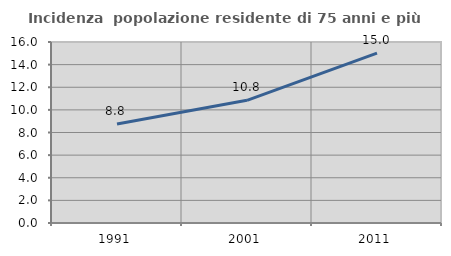
| Category | Incidenza  popolazione residente di 75 anni e più |
|---|---|
| 1991.0 | 8.759 |
| 2001.0 | 10.842 |
| 2011.0 | 15.019 |